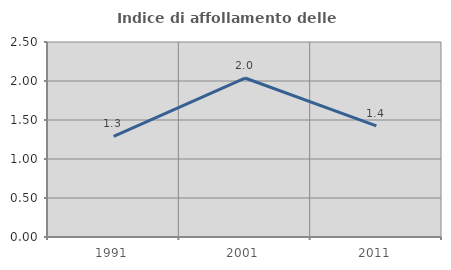
| Category | Indice di affollamento delle abitazioni  |
|---|---|
| 1991.0 | 1.29 |
| 2001.0 | 2.038 |
| 2011.0 | 1.425 |